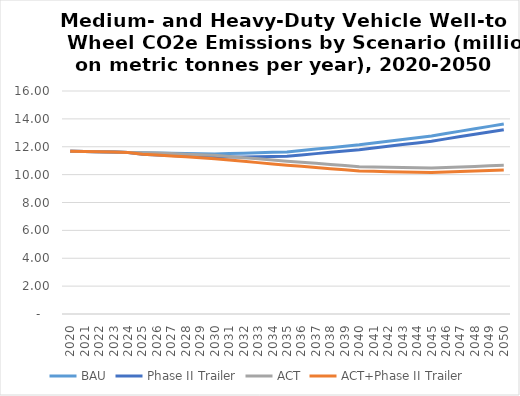
| Category | BAU | Phase II Trailer | ACT | ACT+Phase II Trailer |
|---|---|---|---|---|
| 2020.0 | 11.686 | 11.686 | 11.686 | 11.686 |
| 2021.0 | 11.663 | 11.663 | 11.663 | 11.663 |
| 2022.0 | 11.641 | 11.641 | 11.641 | 11.641 |
| 2023.0 | 11.618 | 11.618 | 11.618 | 11.618 |
| 2024.0 | 11.595 | 11.595 | 11.595 | 11.595 |
| 2025.0 | 11.573 | 11.457 | 11.573 | 11.457 |
| 2026.0 | 11.555 | 11.414 | 11.555 | 11.414 |
| 2027.0 | 11.537 | 11.37 | 11.512 | 11.345 |
| 2028.0 | 11.52 | 11.327 | 11.468 | 11.276 |
| 2029.0 | 11.502 | 11.283 | 11.425 | 11.208 |
| 2030.0 | 11.484 | 11.239 | 11.382 | 11.139 |
| 2031.0 | 11.513 | 11.256 | 11.299 | 11.047 |
| 2032.0 | 11.542 | 11.272 | 11.216 | 10.954 |
| 2033.0 | 11.57 | 11.288 | 11.133 | 10.861 |
| 2034.0 | 11.599 | 11.305 | 11.05 | 10.769 |
| 2035.0 | 11.628 | 11.321 | 10.967 | 10.676 |
| 2036.0 | 11.729 | 11.414 | 10.888 | 10.593 |
| 2037.0 | 11.831 | 11.507 | 10.809 | 10.51 |
| 2038.0 | 11.932 | 11.6 | 10.729 | 10.427 |
| 2039.0 | 12.034 | 11.693 | 10.65 | 10.344 |
| 2040.0 | 12.136 | 11.786 | 10.571 | 10.261 |
| 2041.0 | 12.264 | 11.909 | 10.55 | 10.238 |
| 2042.0 | 12.393 | 12.031 | 10.529 | 10.215 |
| 2043.0 | 12.522 | 12.154 | 10.509 | 10.192 |
| 2044.0 | 12.65 | 12.277 | 10.488 | 10.17 |
| 2045.0 | 12.779 | 12.399 | 10.467 | 10.147 |
| 2046.0 | 12.95 | 12.564 | 10.508 | 10.185 |
| 2047.0 | 13.121 | 12.73 | 10.549 | 10.223 |
| 2048.0 | 13.292 | 12.895 | 10.589 | 10.261 |
| 2049.0 | 13.463 | 13.06 | 10.63 | 10.299 |
| 2050.0 | 13.633 | 13.225 | 10.67 | 10.337 |